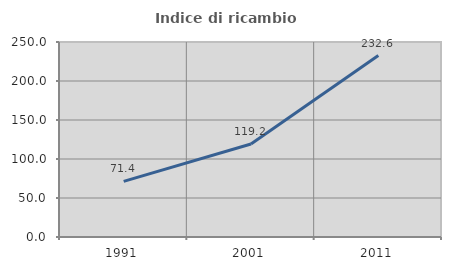
| Category | Indice di ricambio occupazionale  |
|---|---|
| 1991.0 | 71.386 |
| 2001.0 | 119.247 |
| 2011.0 | 232.632 |